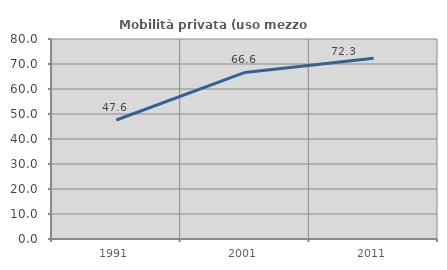
| Category | Mobilità privata (uso mezzo privato) |
|---|---|
| 1991.0 | 47.602 |
| 2001.0 | 66.644 |
| 2011.0 | 72.268 |